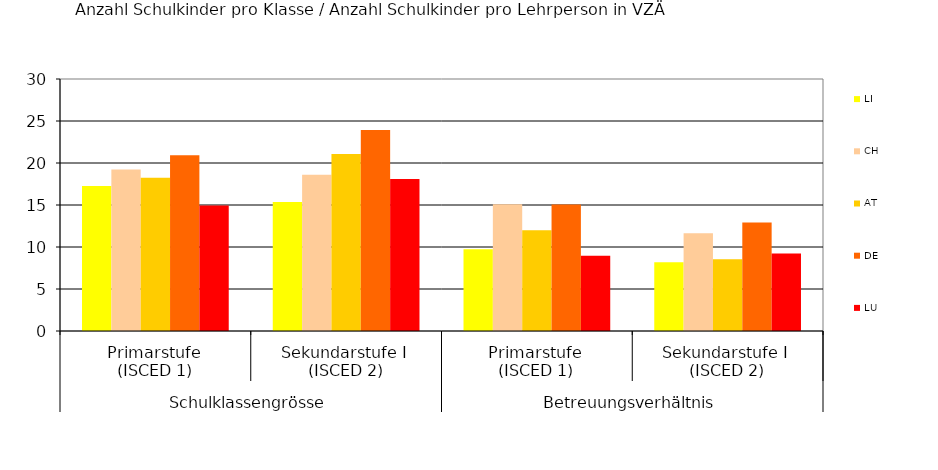
| Category | LI | CH | AT | DE | LU |
|---|---|---|---|---|---|
| 0 | 17.267 | 19.212 | 18.23 | 20.933 | 14.952 |
| 1 | 15.362 | 18.604 | 21.083 | 23.914 | 18.103 |
| 2 | 9.739 | 15.101 | 11.983 | 15.059 | 8.966 |
| 3 | 8.18 | 11.643 | 8.543 | 12.925 | 9.237 |